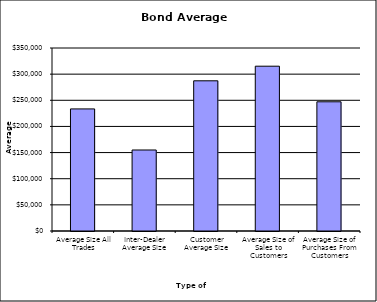
| Category | Security Type |
|---|---|
| Average Size All Trades | 233502.452 |
| Inter-Dealer Average Size | 154931.515 |
| Customer Average Size | 287247.687 |
| Average Size of Sales to Customers | 315190.006 |
| Average Size of Purchases From Customers | 247132.917 |